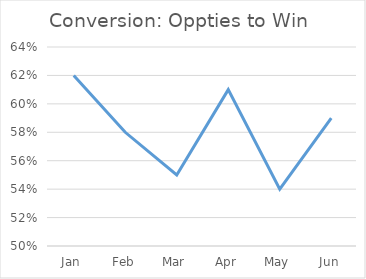
| Category | Conversion: Oppties to Win |
|---|---|
| Jan | 0.62 |
| Feb | 0.58 |
| Mar | 0.55 |
| Apr | 0.61 |
| May | 0.54 |
| Jun | 0.59 |